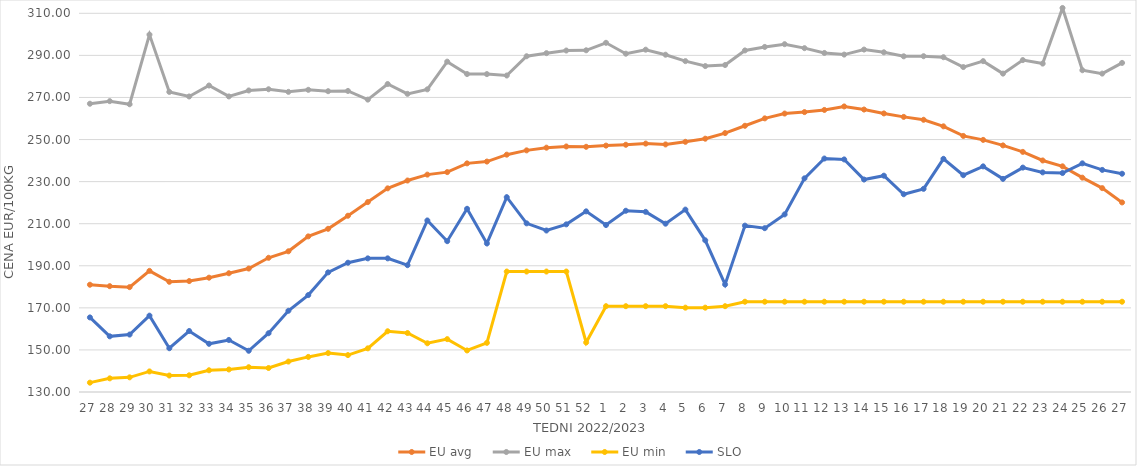
| Category | EU avg | EU max | EU min | SLO |
|---|---|---|---|---|
| 27.0 | 180.992 | 267.02 | 134.44 | 165.45 |
| 28.0 | 180.305 | 268.25 | 136.486 | 156.46 |
| 29.0 | 179.847 | 266.77 | 136.97 | 157.31 |
| 30.0 | 187.576 | 299.87 | 139.777 | 166.29 |
| 31.0 | 182.385 | 272.64 | 137.828 | 150.81 |
| 32.0 | 182.73 | 270.47 | 137.934 | 158.99 |
| 33.0 | 184.343 | 275.68 | 140.33 | 152.91 |
| 34.0 | 186.448 | 270.49 | 140.7 | 154.73 |
| 35.0 | 188.684 | 273.33 | 141.78 | 149.6 |
| 36.0 | 193.792 | 273.91 | 141.41 | 157.93 |
| 37.0 | 196.877 | 272.67 | 144.47 | 168.61 |
| 38.0 | 203.962 | 273.63 | 146.68 | 176.07 |
| 39.0 | 207.574 | 272.98 | 148.499 | 186.86 |
| 40.0 | 213.785 | 273.1 | 147.54 | 191.45 |
| 41.0 | 220.272 | 268.98 | 150.75 | 193.52 |
| 42.0 | 226.803 | 276.39 | 158.87 | 193.52 |
| 43.0 | 230.521 | 271.72 | 158.04 | 190.28 |
| 44.0 | 233.325 | 273.856 | 153.16 | 211.53 |
| 45.0 | 234.517 | 287.021 | 155.13 | 201.69 |
| 46.0 | 238.669 | 281.133 | 149.75 | 217.08 |
| 47.0 | 239.534 | 281.102 | 153.36 | 200.62 |
| 48.0 | 242.81 | 280.434 | 187.26 | 222.61 |
| 49.0 | 244.854 | 289.585 | 187.26 | 210.16 |
| 50.0 | 246.132 | 291.057 | 187.26 | 206.76 |
| 51.0 | 246.705 | 292.307 | 187.26 | 209.69 |
| 52.0 | 246.546 | 292.426 | 153.54 | 215.87 |
| 1.0 | 247.118 | 295.98 | 170.79 | 209.37 |
| 2.0 | 247.516 | 290.8 | 170.79 | 216.15 |
| 3.0 | 248.079 | 292.71 | 170.79 | 215.63 |
| 4.0 | 247.672 | 290.32 | 170.79 | 210 |
| 5.0 | 248.924 | 287.27 | 170.09 | 216.7 |
| 6.0 | 250.4 | 284.92 | 170.09 | 202.1 |
| 7.0 | 253.074 | 285.42 | 170.79 | 181.11 |
| 8.0 | 256.543 | 292.35 | 172.91 | 209.08 |
| 9.0 | 260.066 | 294.02 | 172.91 | 207.87 |
| 10.0 | 262.352 | 295.33 | 172.91 | 214.42 |
| 11.0 | 263.049 | 293.44 | 172.91 | 231.56 |
| 12.0 | 264.068 | 291.15 | 172.91 | 240.97 |
| 13.0 | 265.73 | 290.38 | 172.91 | 240.55 |
| 14.0 | 264.262 | 292.763 | 172.91 | 230.99 |
| 15.0 | 262.411 | 291.46 | 172.91 | 232.82 |
| 16.0 | 260.77 | 289.56 | 172.91 | 224 |
| 17.0 | 259.395 | 289.61 | 172.91 | 226.57 |
| 18.0 | 256.275 | 289.13 | 172.91 | 240.83 |
| 19.0 | 251.716 | 284.45 | 172.91 | 233.05 |
| 20.0 | 249.836 | 287.26 | 172.91 | 237.25 |
| 21.0 | 247.212 | 281.33 | 172.91 | 231.3 |
| 22.0 | 244.135 | 287.77 | 172.91 | 236.67 |
| 23.0 | 240.051 | 286.1 | 172.91 | 234.39 |
| 24.0 | 237.269 | 312.54 | 172.91 | 234.08 |
| 25.0 | 231.874 | 282.95 | 172.91 | 238.69 |
| 26.0 | 226.9 | 281.34 | 172.91 | 235.57 |
| 27.0 | 220.111 | 286.43 | 172.91 | 233.75 |